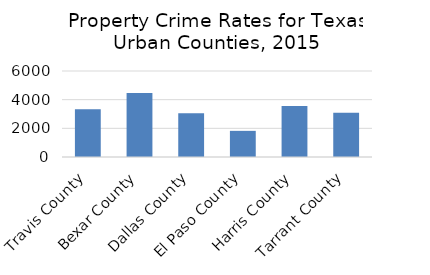
| Category | 2015 |
|---|---|
| Travis County | 3329 |
| Bexar County | 4472 |
| Dallas County | 3060 |
| El Paso County | 1824 |
| Harris County | 3560 |
| Tarrant County | 3079 |